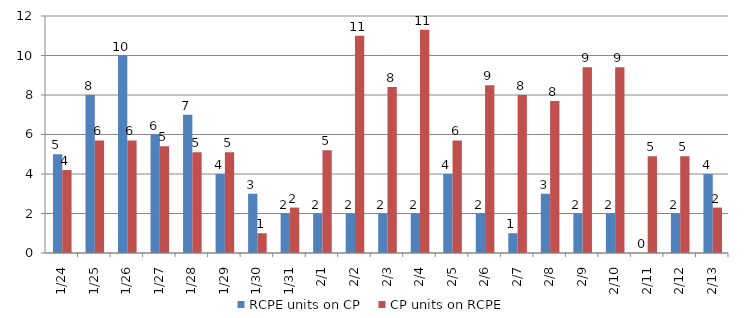
| Category | RCPE units on CP | CP units on RCPE |
|---|---|---|
| 2016-01-24 | 5 | 4.2 |
| 2016-01-25 | 8 | 5.7 |
| 2016-01-26 | 10 | 5.7 |
| 2016-01-27 | 6 | 5.4 |
| 2016-01-28 | 7 | 5.1 |
| 2016-01-29 | 4 | 5.1 |
| 2016-01-30 | 3 | 1 |
| 2016-01-31 | 2 | 2.3 |
| 2016-02-01 | 2 | 5.2 |
| 2016-02-02 | 2 | 11 |
| 2016-02-03 | 2 | 8.4 |
| 2016-02-04 | 2 | 11.3 |
| 2016-02-05 | 4 | 5.7 |
| 2016-02-06 | 2 | 8.5 |
| 2016-02-07 | 1 | 8 |
| 2016-02-08 | 3 | 7.7 |
| 2016-02-09 | 2 | 9.4 |
| 2016-02-10 | 2 | 9.4 |
| 2016-02-11 | 0 | 4.9 |
| 2016-02-12 | 2 | 4.9 |
| 2016-02-13 | 4 | 2.3 |